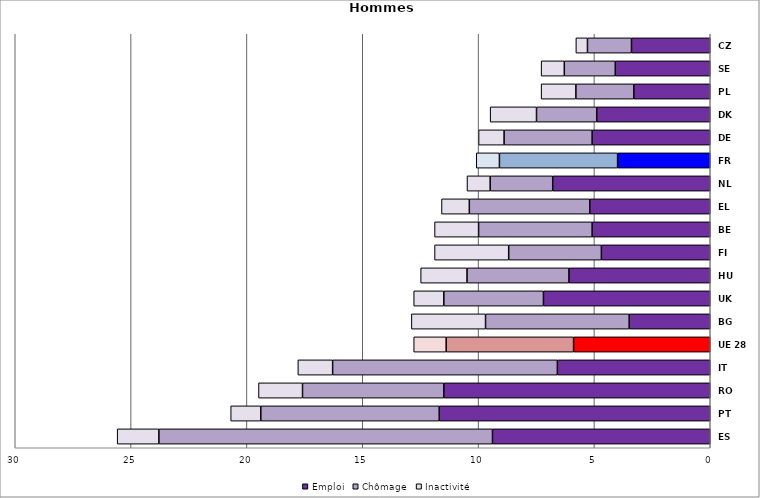
| Category | Emploi | Chômage | Inactivité |
|---|---|---|---|
| ES | 9.4 | 14.4 | 1.8 |
| PT | 11.7 | 7.7 | 1.3 |
| RO | 11.5 | 6.1 | 1.9 |
| IT | 6.6 | 9.7 | 1.5 |
| UE 28 | 5.9 | 5.5 | 1.4 |
| BG | 3.5 | 6.2 | 3.2 |
| UK | 7.2 | 4.3 | 1.3 |
| HU | 6.1 | 4.4 | 2 |
| FI | 4.7 | 4 | 3.2 |
| BE | 5.1 | 4.9 | 1.9 |
| EL | 5.2 | 5.2 | 1.2 |
| NL | 6.8 | 2.7 | 1 |
| FR | 4 | 5.1 | 1 |
| DE | 5.1 | 3.8 | 1.1 |
| DK | 4.9 | 2.6 | 2 |
| PL | 3.3 | 2.5 | 1.5 |
| SE | 4.1 | 2.2 | 1 |
| CZ | 3.4 | 1.9 | 0.5 |